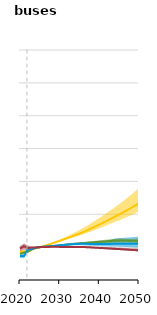
| Category | Reference |
|---|---|
| 2020.0 | 0.955 |
| 2021.0 | 1.029 |
| 2022.0 | 0.972 |
| 2023.0 | 0.991 |
| 2024.0 | 0.989 |
| 2025.0 | 1 |
| 2026.0 | 1.002 |
| 2027.0 | 1.007 |
| 2028.0 | 1.01 |
| 2029.0 | 1.009 |
| 2030.0 | 1.008 |
| 2031.0 | 1.005 |
| 2032.0 | 1.003 |
| 2033.0 | 1.004 |
| 2034.0 | 1.005 |
| 2035.0 | 1.005 |
| 2036.0 | 1.003 |
| 2037.0 | 0.998 |
| 2038.0 | 0.991 |
| 2039.0 | 0.984 |
| 2040.0 | 0.977 |
| 2041.0 | 0.97 |
| 2042.0 | 0.963 |
| 2043.0 | 0.956 |
| 2044.0 | 0.949 |
| 2045.0 | 0.941 |
| 2046.0 | 0.933 |
| 2047.0 | 0.925 |
| 2048.0 | 0.918 |
| 2049.0 | 0.91 |
| 2050.0 | 0.903 |